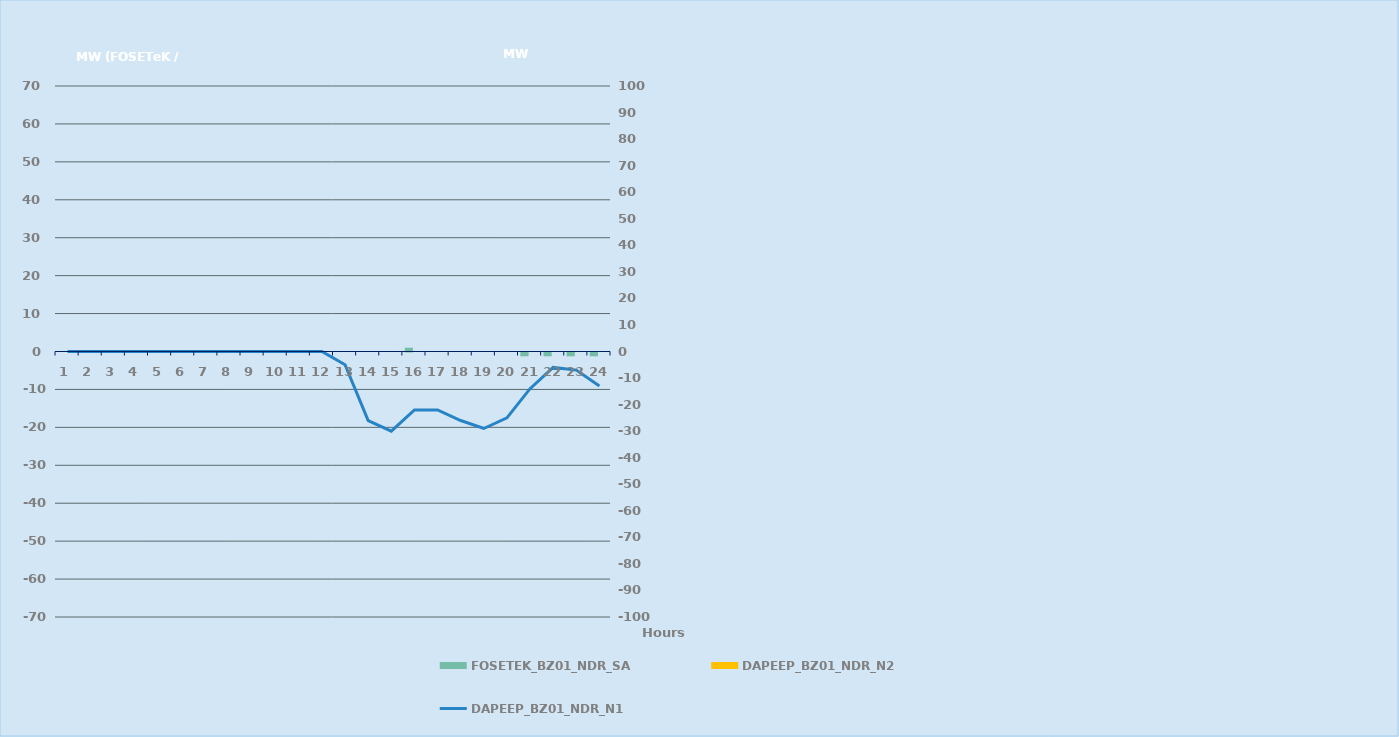
| Category | FOSETEK_BZ01_NDR_SA | DAPEEP_BZ01_NDR_N2 |
|---|---|---|
| 0 | 0 | 0 |
| 1 | 0 | 0 |
| 2 | 0 | 0 |
| 3 | 0 | 0 |
| 4 | 0 | 0 |
| 5 | 0 | 0 |
| 6 | 0 | 0 |
| 7 | 0 | 0 |
| 8 | 0 | 0 |
| 9 | 0 | 0 |
| 10 | 0 | 0 |
| 11 | 0 | 0 |
| 12 | 0 | 0 |
| 13 | 0 | 0 |
| 14 | 0 | 0 |
| 15 | 1 | 0 |
| 16 | 0 | 0 |
| 17 | 0 | 0 |
| 18 | 0 | 0 |
| 19 | 0 | 0 |
| 20 | -1 | 0 |
| 21 | -1 | 0 |
| 22 | -1 | 0 |
| 23 | -1 | 0 |